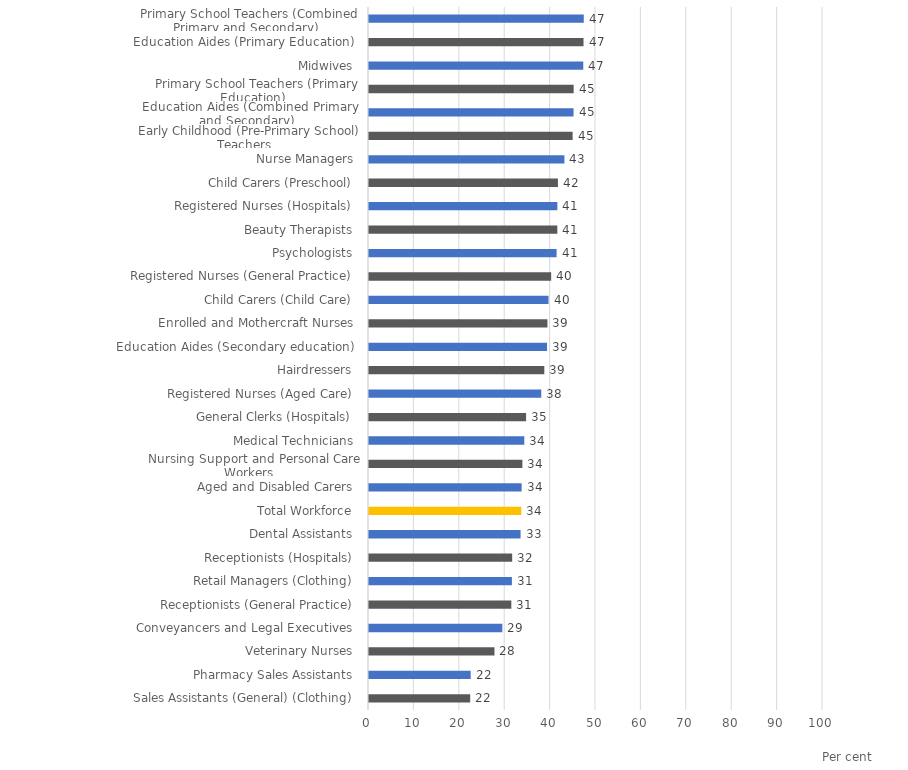
| Category |  % Who did not provide Unpaid Child Care  |
|---|---|
|  Sales Assistants (General) (Clothing)  | 22.289 |
|  Pharmacy Sales Assistants  | 22.398 |
|  Veterinary Nurses  | 27.639 |
|  Conveyancers and Legal Executives  | 29.368 |
|  Receptionists (General Practice)  | 31.351 |
|  Retail Managers (Clothing)  | 31.478 |
|  Receptionists (Hospitals)  | 31.537 |
|  Dental Assistants  | 33.385 |
|  Total Workforce  | 33.545 |
|  Aged and Disabled Carers  | 33.622 |
|  Nursing Support and Personal Care Workers  | 33.788 |
|  Medical Technicians  | 34.212 |
|  General Clerks (Hospitals)  | 34.602 |
|  Registered Nurses (Aged Care)  | 37.946 |
|  Hairdressers  | 38.615 |
|  Education Aides (Secondary education)  | 39.215 |
|  Enrolled and Mothercraft Nurses  | 39.305 |
|  Child Carers (Child Care)  | 39.544 |
|  Registered Nurses (General Practice)  | 40.125 |
|  Psychologists  | 41.323 |
|  Beauty Therapists  | 41.48 |
|  Registered Nurses (Hospitals)  | 41.491 |
|  Child Carers (Preschool)  | 41.617 |
|  Nurse Managers  | 43.043 |
|  Early Childhood (Pre-Primary School) Teachers  | 44.853 |
|  Education Aides (Combined Primary and Secondary)  | 45.054 |
|  Primary School Teachers (Primary Education)  | 45.079 |
|  Midwives  | 47.197 |
|  Education Aides (Primary Education)  | 47.251 |
|  Primary School Teachers (Combined Primary and Secondary)  | 47.307 |